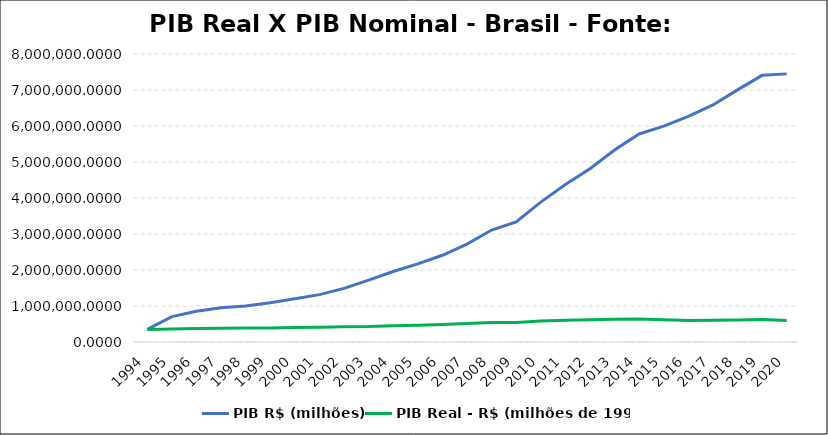
| Category | PIB R$ (milhões)  | PIB Real - R$ (milhões de 1994) |
|---|---|---|
| 1994 | 349204.679 | 349204.679 |
| 1995 | 705991.553 | 363954.364 |
| 1996 | 854763.608 | 371993.621 |
| 1997 | 952089.196 | 384622.232 |
| 1998 | 1002351.019 | 385922.631 |
| 1999 | 1087710.456 | 387728.508 |
| 2000 | 1199092.071 | 404741.839 |
| 2001 | 1315755.468 | 410367.331 |
| 2002 | 1488787.255 | 422897.741 |
| 2003 | 1717950.396 | 427722.281 |
| 2004 | 1957751.213 | 452358.934 |
| 2005 | 2170584.503 | 466844.064 |
| 2006 | 2409449.922 | 485340.373 |
| 2007 | 2720262.938 | 514799.906 |
| 2008 | 3109803.089 | 541024.819 |
| 2009 | 3333039.355 | 540344.145 |
| 2010 | 3885847 | 581022.473 |
| 2011 | 4376382 | 604114.764 |
| 2012 | 4814760 | 615720.872 |
| 2013 | 5331619 | 634222.192 |
| 2014 | 5778953 | 637418.391 |
| 2015 | 5995787 | 614817.043 |
| 2016 | 6269328 | 594676.148 |
| 2017 | 6585479 | 602542.934 |
| 2018 | 7004141 | 613290.292 |
| 2019 | 7407023.573 | 621944.757 |
| 2020 | 7447858.25 | 596699.719 |